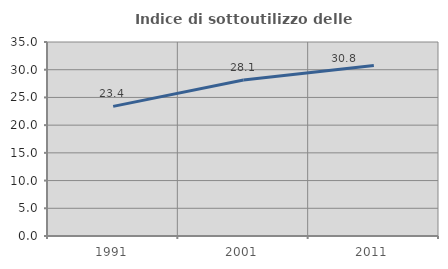
| Category | Indice di sottoutilizzo delle abitazioni  |
|---|---|
| 1991.0 | 23.389 |
| 2001.0 | 28.149 |
| 2011.0 | 30.779 |